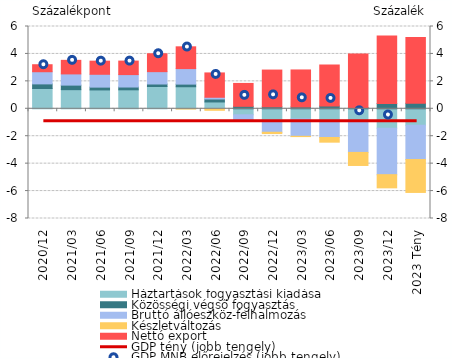
| Category | Háztartások fogyasztási kiadása | Közösségi végső fogyasztás | Bruttó állóeszköz-felhalmozás | Készletváltozás | Nettó export |
|---|---|---|---|---|---|
| 2020.12 | 1.478 | 0.337 | 0.887 | 0 | 0.511 |
| 2021.03 | 1.394 | 0.332 | 0.817 | 0 | 0.989 |
| 2021.06 | 1.375 | 0.204 | 0.937 | 0 | 0.956 |
| 2021.09 | 1.383 | 0.203 | 0.907 | 0 | 0.985 |
| 2021.12 | 1.625 | 0.182 | 0.901 | 0 | 1.305 |
| 2022.03 | 1.607 | 0.192 | 1.132 | -0.015 | 1.587 |
| 2022.06 | 0.498 | 0.217 | 0.127 | -0.11 | 1.774 |
| 2022.09 | -0.439 | 0.179 | -0.43 | 0 | 1.67 |
| 2022.12 | -0.82 | 0.143 | -0.891 | -0.095 | 2.68 |
| 2023.03 | -0.741 | 0.134 | -1.266 | -0.02 | 2.697 |
| 2023.06 | -0.834 | 0.201 | -1.26 | -0.34 | 2.987 |
| 2023.09 | -0.911 | 0.096 | -2.271 | -0.951 | 3.89 |
| 2023.12 | -1.411 | 0.382 | -3.393 | -0.961 | 4.928 |
| 2023 Tény | -1.2 | 0.4 | -2.5 | -2.4 | 4.8 |